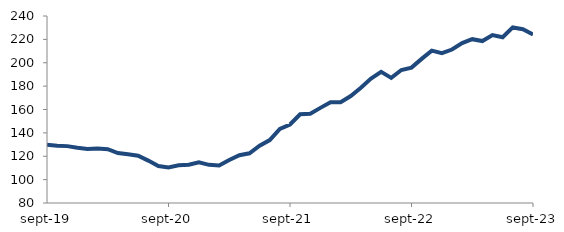
| Category | Series 0 |
|---|---|
| 2019-09-01 | 129.814 |
| 2019-10-01 | 129.013 |
| 2019-11-01 | 128.663 |
| 2019-12-01 | 127.192 |
| 2020-01-01 | 126.144 |
| 2020-02-01 | 126.638 |
| 2020-03-01 | 125.992 |
| 2020-04-01 | 122.726 |
| 2020-05-01 | 121.669 |
| 2020-06-01 | 120.485 |
| 2020-07-01 | 116.268 |
| 2020-08-01 | 111.597 |
| 2020-09-01 | 110.39 |
| 2020-10-01 | 112.229 |
| 2020-11-01 | 112.769 |
| 2020-12-01 | 114.741 |
| 2021-01-01 | 112.625 |
| 2021-02-01 | 112.14 |
| 2021-03-01 | 116.74 |
| 2021-04-01 | 120.911 |
| 2021-05-01 | 122.536 |
| 2021-06-01 | 128.968 |
| 2021-07-01 | 133.864 |
| 2021-08-01 | 143.384 |
| 2021-09-01 | 147.196 |
| 2021-10-01 | 155.883 |
| 2021-11-01 | 156.426 |
| 2021-12-01 | 161.4 |
| 2022-01-01 | 166.276 |
| 2022-02-01 | 166.219 |
| 2022-03-01 | 171.531 |
| 2022-04-01 | 178.644 |
| 2022-05-01 | 186.465 |
| 2022-06-01 | 192.187 |
| 2022-07-01 | 187.044 |
| 2022-08-01 | 193.806 |
| 2022-09-01 | 195.846 |
| 2022-10-01 | 203.287 |
| 2022-11-01 | 210.344 |
| 2022-12-01 | 208.16 |
| 2023-01-01 | 211.29 |
| 2023-02-01 | 216.772 |
| 2023-03-01 | 220.156 |
| 2023-04-01 | 218.537 |
| 2023-05-01 | 223.702 |
| 2023-06-01 | 221.798 |
| 2023-07-01 | 230.236 |
| 2023-08-01 | 228.637 |
| 2023-09-01 | 224.175 |